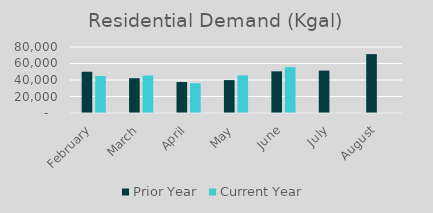
| Category | Prior Year | Current Year |
|---|---|---|
| February | 49996 | 44769 |
| March | 42168 | 45502 |
| April | 37537 | 36081 |
| May | 39883 | 45570 |
| June | 50498 | 55597 |
| July | 51383 | 0 |
| August | 71400 | 0 |